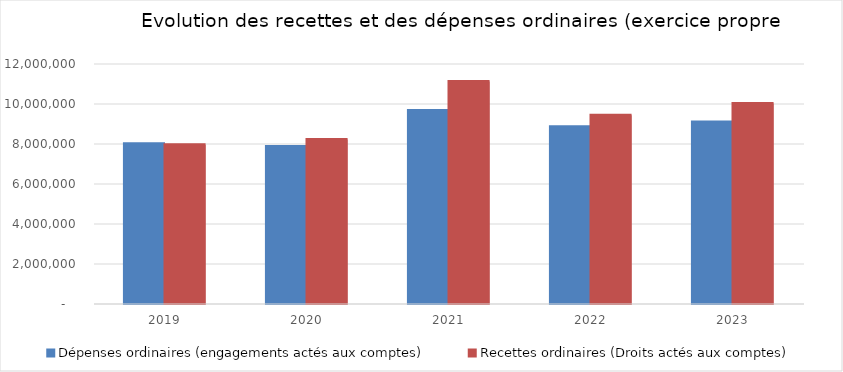
| Category | Dépenses ordinaires (engagements actés aux comptes) | Recettes ordinaires (Droits actés aux comptes) |
|---|---|---|
| 2019.0 | 8012967.69 | 7963043.07 |
| 2020.0 | 7875435.81 | 8221047.49 |
| 2021.0 | 9670836.16 | 11123711.89 |
| 2022.0 | 8864120.54 | 9442617.26 |
| 2023.0 | 9104677.17 | 10019989.71 |